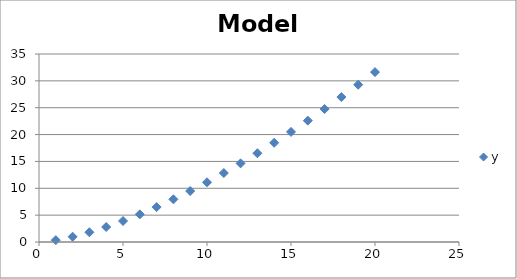
| Category | y |
|---|---|
| 1.0 | 0.345 |
| 2.0 | 0.981 |
| 3.0 | 1.809 |
| 4.0 | 2.792 |
| 5.0 | 3.909 |
| 6.0 | 5.146 |
| 7.0 | 6.493 |
| 8.0 | 7.942 |
| 9.0 | 9.486 |
| 10.0 | 11.12 |
| 11.0 | 12.839 |
| 12.0 | 14.64 |
| 13.0 | 16.518 |
| 14.0 | 18.472 |
| 15.0 | 20.497 |
| 16.0 | 22.593 |
| 17.0 | 24.756 |
| 18.0 | 26.985 |
| 19.0 | 29.278 |
| 20.0 | 31.633 |